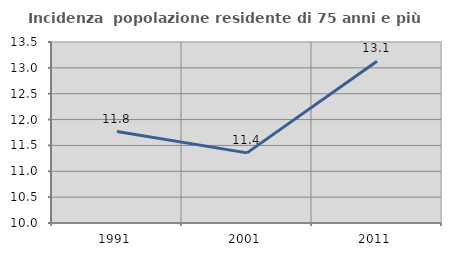
| Category | Incidenza  popolazione residente di 75 anni e più |
|---|---|
| 1991.0 | 11.768 |
| 2001.0 | 11.356 |
| 2011.0 | 13.127 |